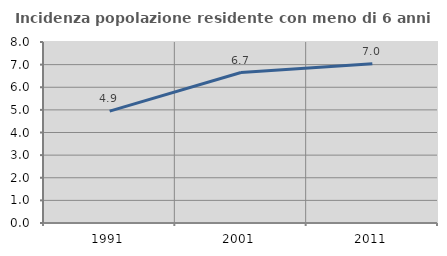
| Category | Incidenza popolazione residente con meno di 6 anni |
|---|---|
| 1991.0 | 4.944 |
| 2001.0 | 6.65 |
| 2011.0 | 7.042 |